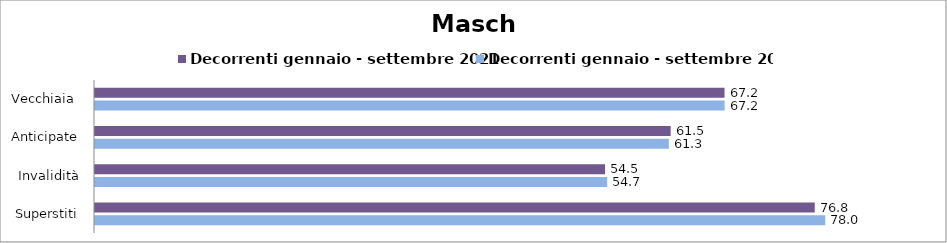
| Category | Decorrenti gennaio - settembre 2021 | Decorrenti gennaio - settembre 2022 |
|---|---|---|
| Vecchiaia  | 67.21 | 67.22 |
| Anticipate | 61.46 | 61.26 |
| Invalidità | 54.45 | 54.68 |
| Superstiti | 76.84 | 77.96 |